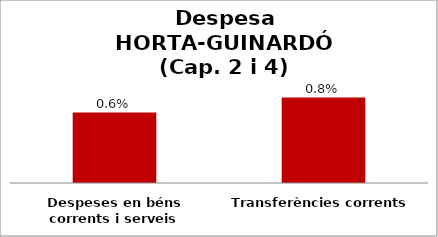
| Category | Series 0 |
|---|---|
| Despeses en béns corrents i serveis | 0.006 |
| Transferències corrents | 0.008 |